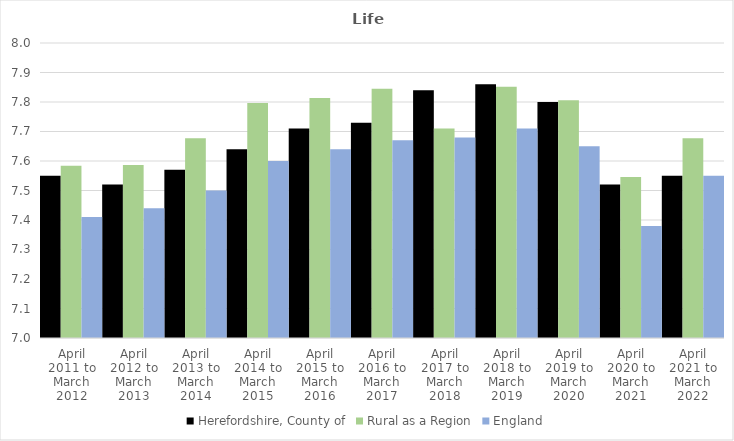
| Category | Herefordshire, County of | Rural as a Region | England |
|---|---|---|---|
| April 2011 to March 2012 | 7.55 | 7.584 | 7.41 |
| April 2012 to March 2013 | 7.52 | 7.586 | 7.44 |
| April 2013 to March 2014 | 7.57 | 7.677 | 7.5 |
| April 2014 to March 2015 | 7.64 | 7.797 | 7.6 |
| April 2015 to March 2016 | 7.71 | 7.813 | 7.64 |
| April 2016 to March 2017 | 7.73 | 7.845 | 7.67 |
| April 2017 to March 2018 | 7.84 | 7.71 | 7.68 |
| April 2018 to March 2019 | 7.86 | 7.852 | 7.71 |
| April 2019 to March 2020 | 7.8 | 7.806 | 7.65 |
| April 2020 to March 2021 | 7.52 | 7.546 | 7.38 |
| April 2021 to March 2022 | 7.55 | 7.677 | 7.55 |